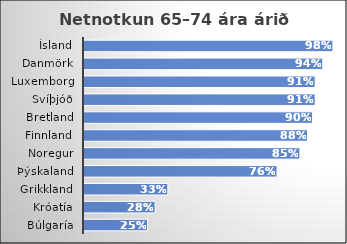
| Category | Series 0 |
|---|---|
| Búlgaría | 0.25 |
| Króatía | 0.28 |
| Grikkland | 0.33 |
| Þýskaland | 0.76 |
| Noregur | 0.85 |
| Finnland | 0.88 |
| Bretland | 0.9 |
| Svíþjóð | 0.91 |
| Luxemborg | 0.91 |
| Danmörk | 0.94 |
| Ísland | 0.98 |